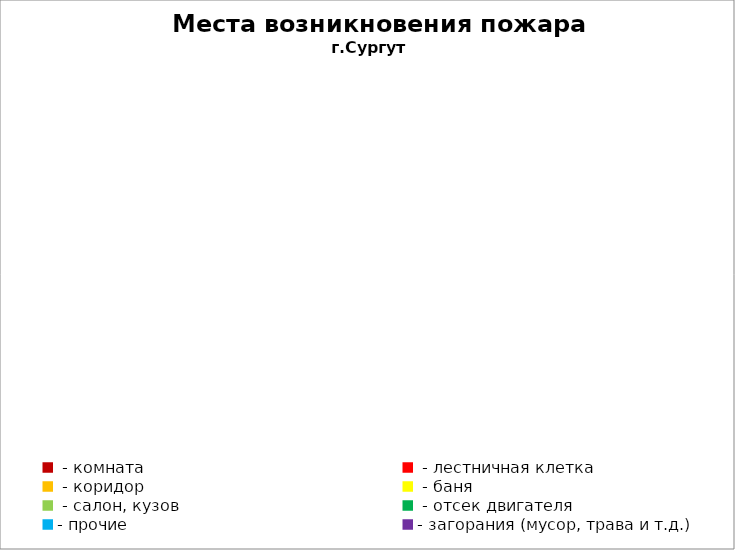
| Category | Места возникновения пожара |
|---|---|
|  - комната | 34 |
|  - лестничная клетка | 3 |
|  - коридор | 3 |
|  - баня | 5 |
|  - салон, кузов | 8 |
|  - отсек двигателя | 15 |
| - прочие | 32 |
| - загорания (мусор, трава и т.д.)  | 26 |